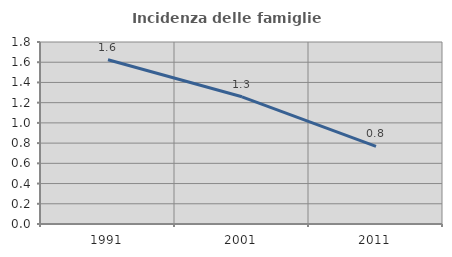
| Category | Incidenza delle famiglie numerose |
|---|---|
| 1991.0 | 1.625 |
| 2001.0 | 1.258 |
| 2011.0 | 0.768 |